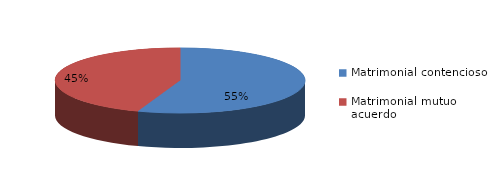
| Category | Series 0 |
|---|---|
| 0 | 168 |
| 1 | 135 |